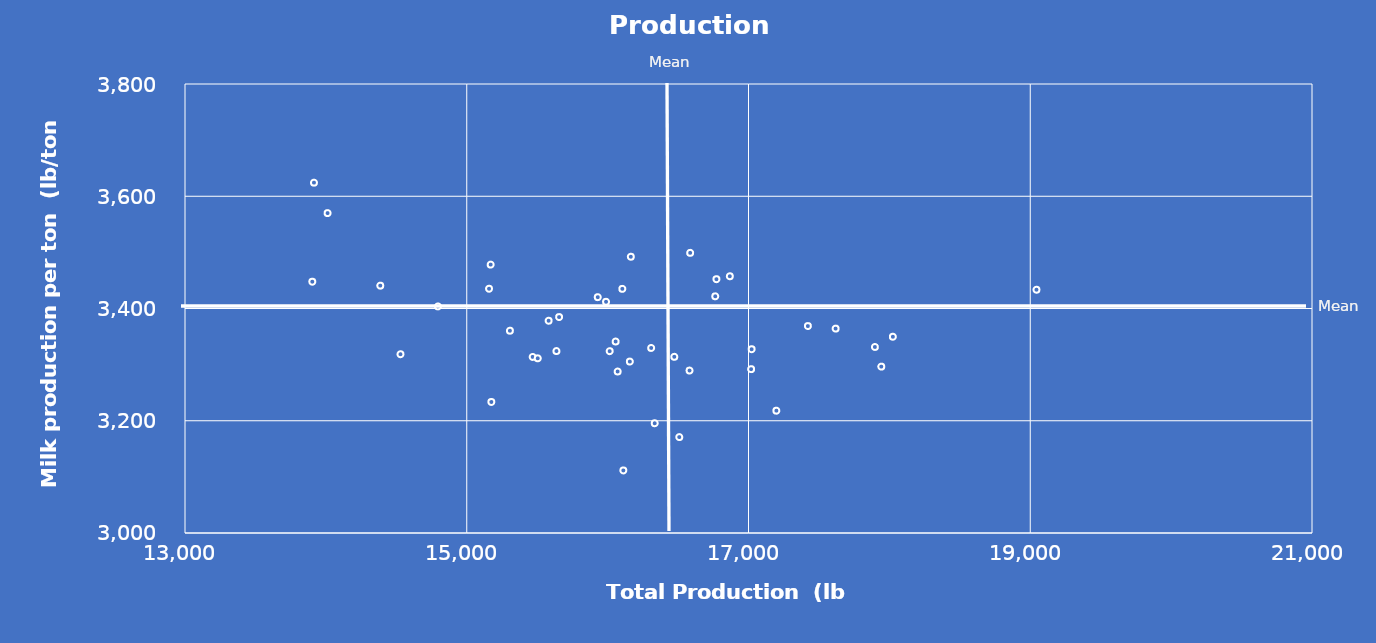
| Category | Series 0 |
|---|---|
| 16071.25 | 3287.75 |
| 16157.825137929 | 3305.446 |
| 15636.575137929 | 3324.196 |
| 17022.325137929 | 3327.446 |
| 15929.978121764 | 3420.196 |
| 14529.5 | 3318.5 |
| 19044.075137929 | 3433.446 |
| 17897.162568964 | 3331.473 |
| 17421.575137929 | 3368.696 |
| 16309.075137929 | 3329.696 |
| 16581.575137929 | 3289.446 |
| 16764.075137929 | 3421.696 |
| 10837.316897576 | 2894.446 |
| 13915.412568964 | 3624.223 |
| 14012.325137929 | 3569.946 |
| 15158.075137929 | 3435.196 |
| 16056.912568964 | 3341.223 |
| 17942.575137929 | 3296.446 |
| 15306.325137929 | 3360.446 |
| 15655.575137929 | 3384.696 |
| 16164.662568964 | 3492.223 |
| 15581.075137929 | 3378.196 |
| 18024.825137929 | 3349.696 |
| 16014.575137929 | 3323.946 |
| 16772.325137929 | 3452.196 |
| 14795.662568964 | 3403.723 |
| 16111.575137929 | 3111.446 |
| 16508.64478843 | 3170.881 |
| 16334.311455097 | 3195.547 |
| 16104.662568964 | 3434.973 |
| 16867.325137929 | 3457.446 |
| 14386.075137929 | 3440.696 |
| 15988.825137929 | 3411.946 |
| 15169.662568964 | 3478.223 |
| 15467.825137929 | 3313.696 |
| 17618.325137929 | 3364.196 |
| 13903.662568964 | 3447.723 |
| 17018.575137929 | 3291.946 |
| 16473.325137929 | 3313.946 |
| 16585.825137929 | 3499.196 |
| 15504.162568964 | 3311.223 |
| 15174.575137929 | 3233.446 |
| 17197.825137928 | 3217.946 |